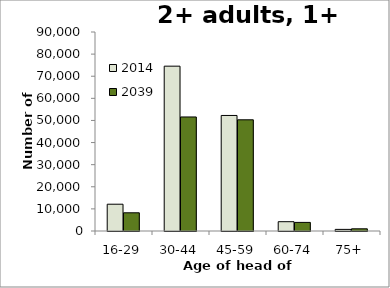
| Category | 2014 | 2039 |
|---|---|---|
| 16-29 | 12114 | 8239 |
| 30-44 | 74552 | 51572 |
| 45-59 | 52255 | 50287 |
| 60-74 | 4209 | 3892 |
| 75+ | 734 | 992 |